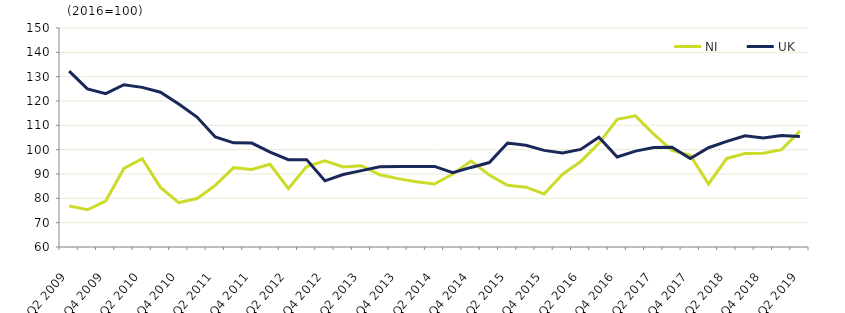
| Category | NI  | UK  |
|---|---|---|
| Q2 2009 | 76.9 | 132.3 |
|  | 75.3 | 125 |
| Q4 2009 | 78.9 | 123 |
|  | 92.3 | 126.7 |
| Q2 2010 | 96.3 | 125.6 |
|  | 84.5 | 123.6 |
| Q4 2010 | 78.2 | 118.8 |
|  | 79.9 | 113.4 |
| Q2 2011 | 85.3 | 105.2 |
|  | 92.6 | 102.8 |
| Q4 2011 | 91.9 | 102.7 |
|  | 94 | 99 |
| Q2 2012 | 84 | 95.9 |
|  | 93.1 | 95.9 |
| Q4 2012 | 95.4 | 87.2 |
|  | 92.9 | 89.8 |
| Q2 2013 | 93.4 | 91.4 |
|  | 89.7 | 93 |
| Q4 2013 | 88.1 | 93.1 |
|  | 86.8 | 93.1 |
| Q2 2014 | 85.9 | 93.1 |
|  | 90 | 90.5 |
| Q4 2014 | 95.3 | 92.7 |
|  | 89.6 | 94.7 |
| Q2 2015 | 85.4 | 102.7 |
|  | 84.6 | 101.8 |
| Q4 2015 | 81.8 | 99.7 |
|  | 89.8 | 98.6 |
| Q2 2016 | 95.1 | 100.1 |
|  | 102.6 | 105.1 |
| Q4 2016 | 112.5 | 97 |
|  | 113.9 | 99.4 |
| Q2 2017 | 106.4 | 100.9 |
|  | 99.7 | 101 |
| Q4 2017 | 97.7 | 96.4 |
|  | 85.9 | 100.8 |
| Q2 2018 | 96.4 | 103.4 |
|  | 98.4 | 105.7 |
| Q4 2018 | 98.5 | 104.8 |
|  | 100 | 105.8 |
| Q2 2019 | 107.6 | 105.4 |